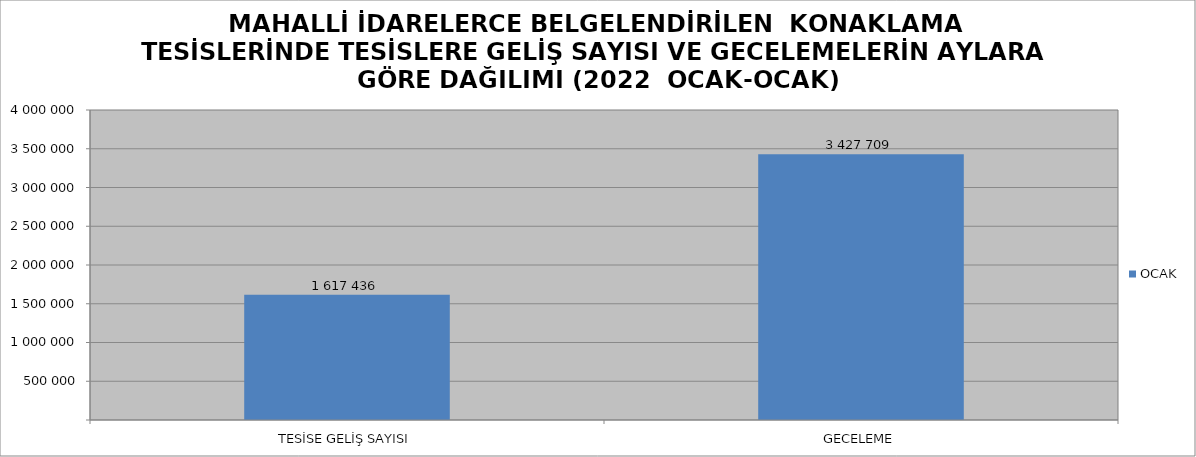
| Category | OCAK |
|---|---|
| TESİSE GELİŞ SAYISI | 1617436 |
| GECELEME | 3427709 |